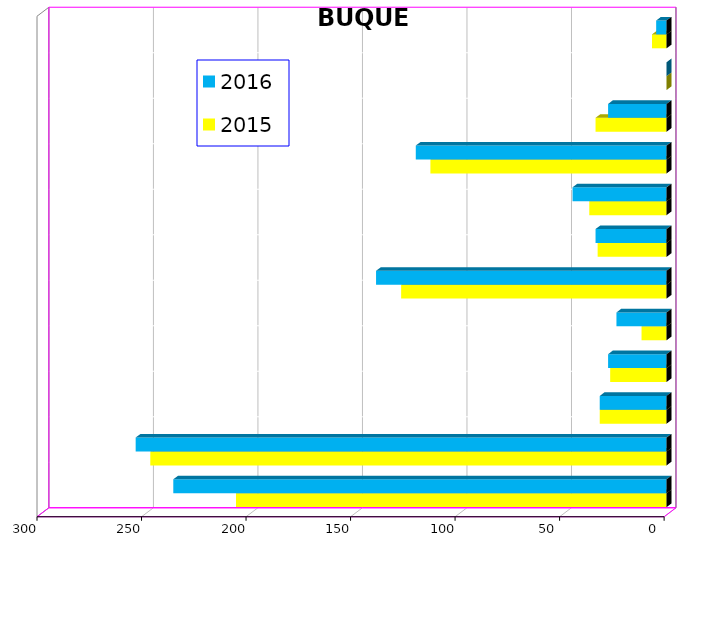
| Category | 2015 | 2016 |
|---|---|---|
| ICAVE | 206 | 236 |
| CICE | 247 | 254 |
| T. C. E. | 32 | 32 |
| CARGILL | 27 | 28 |
| TMV | 12 | 24 |
| SSA | 127 | 139 |
| SEPSA | 33 | 34 |
| VOPAK | 37 | 45 |
| CPV | 113 | 120 |
| EXCELLENCE | 34 | 28 |
| APASCO | 0 | 0 |
| SIP | 7 | 5 |